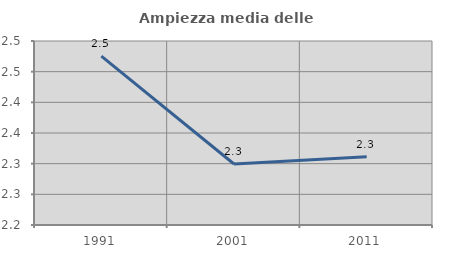
| Category | Ampiezza media delle famiglie |
|---|---|
| 1991.0 | 2.475 |
| 2001.0 | 2.299 |
| 2011.0 | 2.311 |